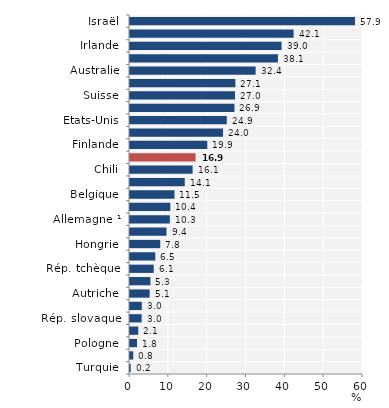
| Category | Series 0 |
|---|---|
| Israël | 57.945 |
| Nouvelle-Zélande | 42.124 |
| Irlande | 39.029 |
| Norvège | 38.093 |
| Australie | 32.356 |
| Suède | 27.14 |
| Suisse | 27.048 |
| Royaume-Uni | 26.886 |
| Etats-Unis | 24.927 |
| Canada | 23.962 |
| Finlande | 19.908 |
| OCDE28 | 16.887 |
| Chili | 16.12 |
| Slovénie | 14.099 |
| Belgique | 11.455 |
| France | 10.38 |
| Allemagne ¹ | 10.258 |
| Espagne ¹ | 9.4 |
| Hongrie | 7.787 |
| Lettonie | 6.516 |
| Rép. tchèque | 6.101 |
| Danemark | 5.267 |
| Autriche | 5.061 |
| Estonie | 3.037 |
| Rép. slovaque | 2.994 |
| Pays-Bas | 2.128 |
| Pologne | 1.799 |
| Italie | 0.832 |
| Turquie | 0.185 |